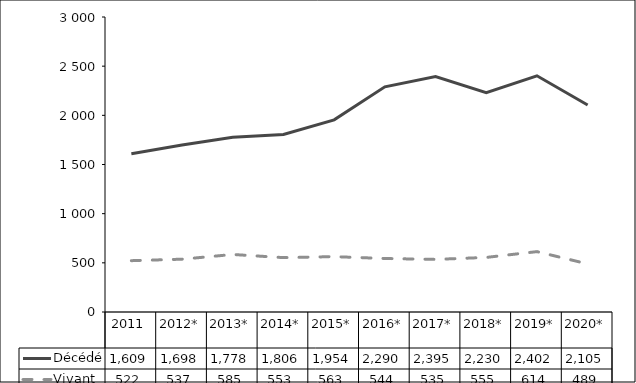
| Category | Décédé | Vivant |
|---|---|---|
| 2011 | 1609 | 522 |
| 2012* | 1698 | 537 |
| 2013* | 1778 | 585 |
| 2014* | 1806 | 553 |
| 2015* | 1954 | 563 |
| 2016* | 2290 | 544 |
| 2017* | 2395 | 535 |
| 2018* | 2230 | 555 |
| 2019* | 2402 | 614 |
| 2020* | 2105 | 489 |